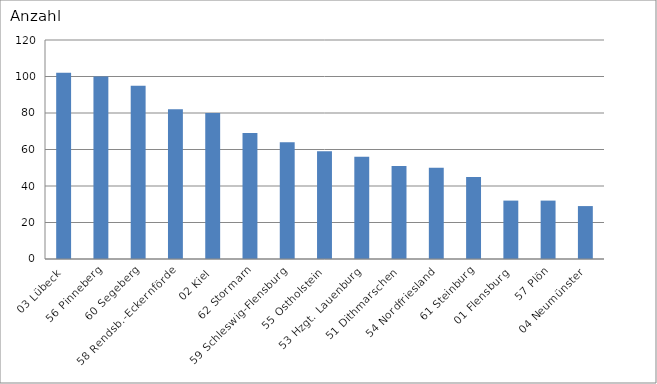
| Category | 03 Lübeck 56 Pinneberg 60 Segeberg 58 Rendsb.-Eckernförde 02 Kiel 62 Stormarn 59 Schleswig-Flensburg 55 Ostholstein 53 Hzgt. Lauenburg 51 Dithmarschen 54 Nordfriesland 61 Steinburg 01 Flensburg 57 Plön 04 Neumünster |
|---|---|
| 03 Lübeck | 102 |
| 56 Pinneberg | 100 |
| 60 Segeberg | 95 |
| 58 Rendsb.-Eckernförde | 82 |
| 02 Kiel | 80 |
| 62 Stormarn | 69 |
| 59 Schleswig-Flensburg | 64 |
| 55 Ostholstein | 59 |
| 53 Hzgt. Lauenburg | 56 |
| 51 Dithmarschen | 51 |
| 54 Nordfriesland | 50 |
| 61 Steinburg | 45 |
| 01 Flensburg | 32 |
| 57 Plön | 32 |
| 04 Neumünster | 29 |